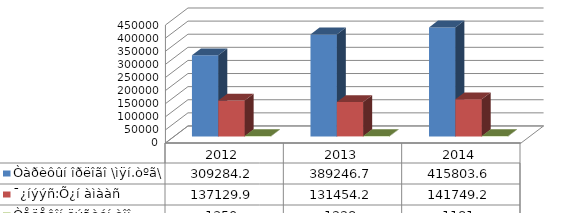
| Category | Òàðèôûí îðëîãî \ìÿí.òºã\ | ¯¿íýýñ:Õ¿í àìààñ  | Òåëåôîí öýãèéí òîî  |
|---|---|---|---|
| 2012.0 | 309284.2 | 137129.9 | 1350 |
| 2013.0 | 389246.7 | 131454.2 | 1228 |
| 2014.0 | 415803.6 | 141749.2 | 1181 |